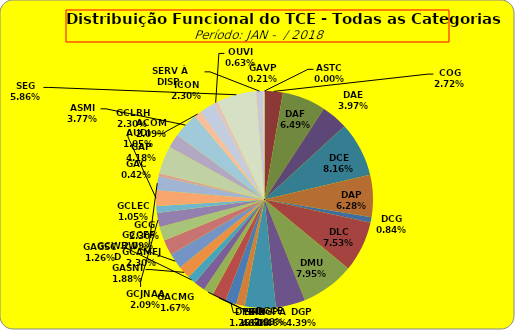
| Category | ASTC |
|---|---|
| ASTC | 0 |
| COG | 13 |
| DAF | 31 |
| DAE | 19 |
| DCE | 39 |
| DAP | 30 |
| DCG | 4 |
| DLC | 36 |
| DMU | 38 |
| DGP | 21 |
| DIN | 22 |
| DPE | 6 |
| DRR | 8 |
| DGCE | 10 |
| DGPA | 7 |
| GACMG | 8 |
| GAGSC | 6 |
| GASNI | 9 |
| GCG | 11 |
| GCAMFJ | 11 |
| GCCFF | 10 |
| GCJNAA | 10 |
| GCLEC | 5 |
| GCLRH | 11 |
| GCWRWD | 10 |
| GAC | 2 |
| GAP | 20 |
| ACOM | 10 |
| ASMI | 18 |
| AUDI | 5 |
| ICON | 11 |
| OUVI | 3 |
| SEG | 28 |
| SERV À DISP. | 5 |
| GAVP | 1 |